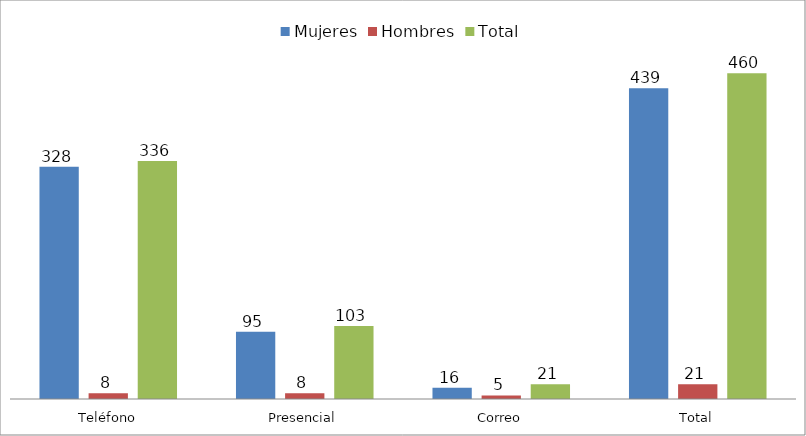
| Category | Mujeres | Hombres | Total |
|---|---|---|---|
| Teléfono | 328 | 8 | 336 |
| Presencial | 95 | 8 | 103 |
| Correo | 16 | 5 | 21 |
| Total | 439 | 21 | 460 |